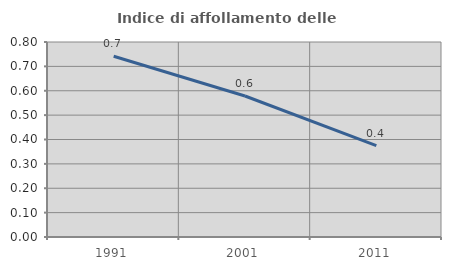
| Category | Indice di affollamento delle abitazioni  |
|---|---|
| 1991.0 | 0.742 |
| 2001.0 | 0.578 |
| 2011.0 | 0.375 |